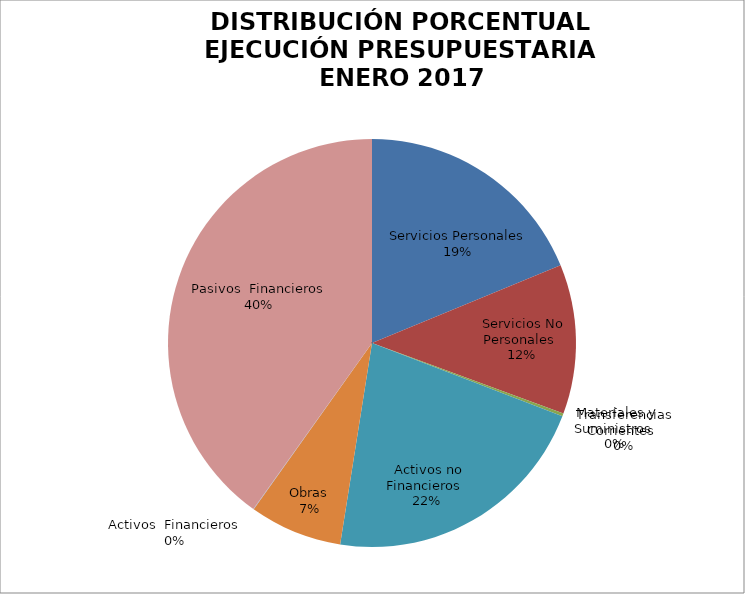
| Category | Series 0 | Series 1 |
|---|---|---|
| Servicios Personales | 10958278.3 | 0.95 |
| Servicios No Personales | 6918859.72 | 0.6 |
| Materiales y Suministros | 132593.39 | 0.011 |
| Transferencias Corrientes | 0 | 0 |
| Activos no Financieros | 12641298.53 | 1.095 |
| Obras | 4290242.55 | 0.082 |
| Activos  Financieros | 21600 | 0.002 |
| Pasivos  Financieros | -23422303.79 | -2.03 |